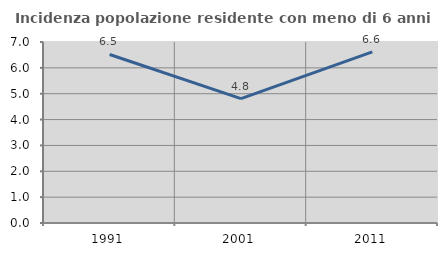
| Category | Incidenza popolazione residente con meno di 6 anni |
|---|---|
| 1991.0 | 6.518 |
| 2001.0 | 4.813 |
| 2011.0 | 6.616 |